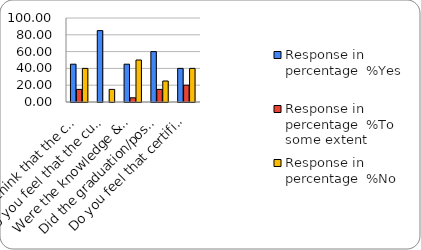
| Category | Response in percentage  |
|---|---|
| Do you think that the curriculum which you had during your graduation/post graduation has provided you with the knowledge & skills necessary to get employed/Self-employed or start own business? | 40 |
| Do you feel that the curriculum you studied is helpful in progression to higher studies? | 15 |
| Were the knowledge & skills acquired through the curriculum useful to you while working on the job?   | 50 |
| Did the graduation/post-graduation programme bring about any attitudinal and behavioural change in you? | 25 |
| Do you feel that certificate/ diploma courses offered by the college in addition to the curriculum lead to better career prospects? | 40 |